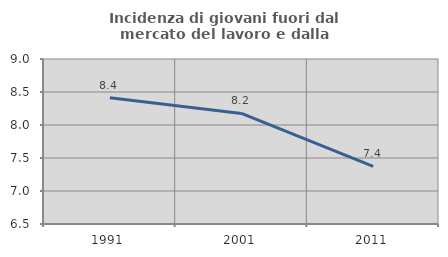
| Category | Incidenza di giovani fuori dal mercato del lavoro e dalla formazione  |
|---|---|
| 1991.0 | 8.413 |
| 2001.0 | 8.175 |
| 2011.0 | 7.373 |